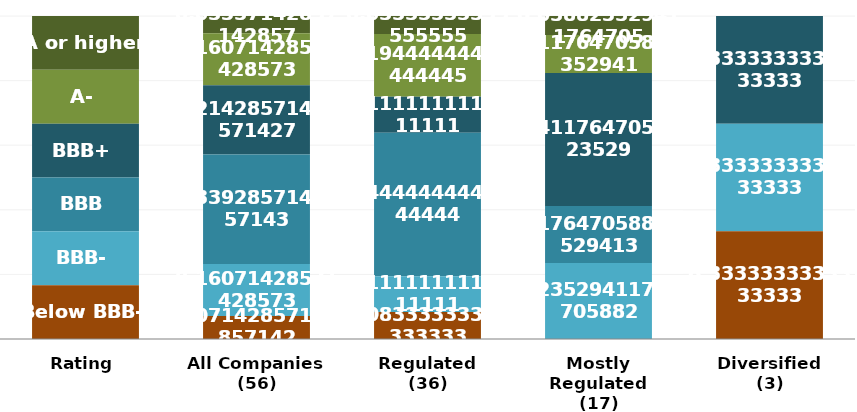
| Category | A or higher | A- | BBB+ | BBB | BBB- | Below BBB- |
|---|---|---|---|---|---|---|
| Rating | 1 | 1 | 1 | 1 | 1 | 1 |
| All Companies
(56) | 3 | 9 | 12 | 19 | 9 | 4 |
| Regulated
(36) | 2 | 7 | 4 | 16 | 4 | 3 |
| Mostly Regulated
(17) | 1 | 2 | 7 | 3 | 4 | 0 |
| Diversified
(3) | 0 | 0 | 1 | 0 | 1 | 1 |